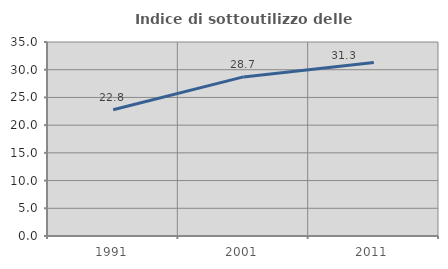
| Category | Indice di sottoutilizzo delle abitazioni  |
|---|---|
| 1991.0 | 22.776 |
| 2001.0 | 28.703 |
| 2011.0 | 31.313 |